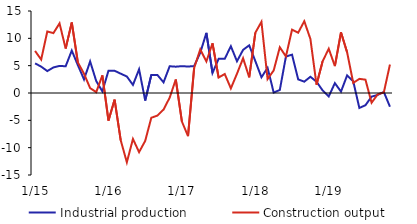
| Category | Industrial production | Construction output |
|---|---|---|
|  1/15 | 5.423 | 7.692 |
| 2 | 4.824 | 6.12 |
| 3 | 4.011 | 11.252 |
| 4 | 4.673 | 10.955 |
| 5 | 4.954 | 12.736 |
| 6 | 4.89 | 8.133 |
| 7 | 7.761 | 12.894 |
| 8 | 5.085 | 5.572 |
| 9 | 2.48 | 3.521 |
| 10 | 5.77 | 0.886 |
| 11 | 2.183 | 0.153 |
| 12 | 0.298 | 3.229 |
|  1/16 | 4.082 | -5.04 |
| 2 | 4.067 | -1.217 |
| 3 | 3.536 | -8.648 |
| 4 | 3.02 | -12.675 |
| 5 | 1.479 | -8.404 |
| 6 | 4.337 | -10.818 |
| 7 | -1.377 | -8.761 |
| 8 | 3.3 | -4.531 |
| 9 | 3.287 | -4.125 |
| 10 | 1.948 | -3.028 |
| 11 | 4.893 | -0.85 |
| 12 | 4.815 | 2.467 |
|  1/17 | 4.911 | -5.228 |
| 2 | 4.842 | -7.902 |
| 3 | 4.923 | 4.597 |
| 4 | 7.366 | 7.967 |
| 5 | 10.999 | 5.767 |
| 6 | 3.668 | 9.098 |
| 7 | 6.243 | 2.827 |
| 8 | 6.251 | 3.475 |
| 9 | 8.557 | 0.844 |
| 10 | 5.808 | 3.524 |
| 11 | 7.89 | 6.357 |
| 12 | 8.721 | 2.867 |
|  1/18 | 5.838 | 11.019 |
| 2 | 2.875 | 13.021 |
| 3 | 4.602 | 2.548 |
| 4 | 0.087 | 4.129 |
| 5 | 0.553 | 8.363 |
| 6 | 6.668 | 6.679 |
| 7 | 7.015 | 11.593 |
| 8 | 2.494 | 11.032 |
| 9 | 2.074 | 13.129 |
| 10 | 2.97 | 9.886 |
| 11 | 2.062 | 1.516 |
| 12 | 0.466 | 5.814 |
|  1/19 | -0.618 | 8.09 |
| 2 | 1.802 | 4.926 |
| 3 | 0.253 | 11.095 |
| 4 | 3.222 | 7.44 |
| 5 | 2.144 | 1.844 |
| 6 | -2.737 | 2.585 |
| 7 | -2.235 | 2.438 |
| 8 | -0.668 | -1.776 |
| 9 | -0.352 | -0.247 |
| 10 | 0.198 | 0.098 |
| 11 | -2.514 | 5.205 |